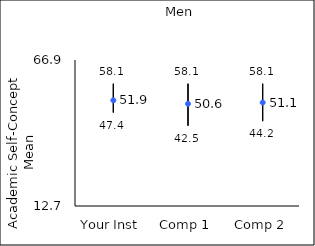
| Category | 25th percentile | 75th percentile | Mean |
|---|---|---|---|
| Your Inst | 47.4 | 58.1 | 51.92 |
| Comp 1 | 42.5 | 58.1 | 50.63 |
| Comp 2 | 44.2 | 58.1 | 51.11 |